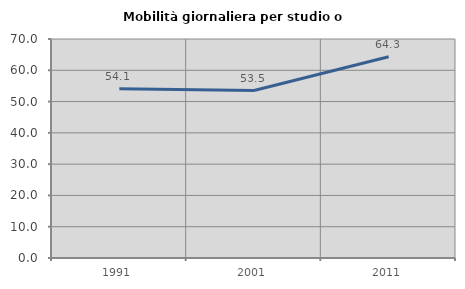
| Category | Mobilità giornaliera per studio o lavoro |
|---|---|
| 1991.0 | 54.096 |
| 2001.0 | 53.529 |
| 2011.0 | 64.344 |